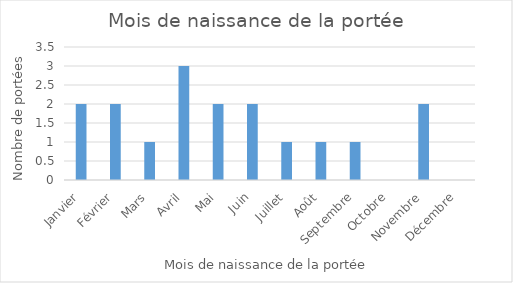
| Category | Series 0 |
|---|---|
| Janvier | 2 |
| Février | 2 |
| Mars | 1 |
| Avril | 3 |
| Mai | 2 |
| Juin | 2 |
| Juillet | 1 |
| Août | 1 |
| Septembre | 1 |
| Octobre | 0 |
| Novembre | 2 |
| Décembre | 0 |